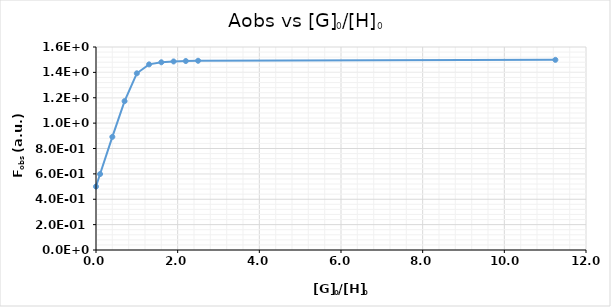
| Category | Series 0 |
|---|---|
| 0.0 | 0.5 |
| 0.1 | 0.599 |
| 0.4 | 0.892 |
| 0.7 | 1.173 |
| 1.0 | 1.393 |
| 1.3 | 1.463 |
| 1.6 | 1.48 |
| 1.9 | 1.486 |
| 2.2 | 1.489 |
| 2.5 | 1.492 |
| 11.25 | 1.499 |